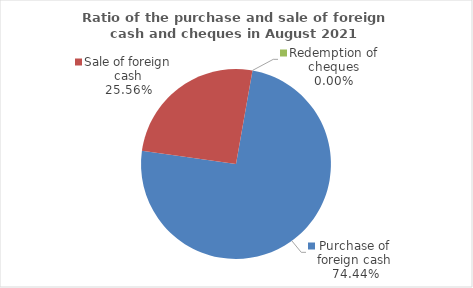
| Category | Series 0 |
|---|---|
| Purchase of foreign cash | 74.438 |
| Sale of foreign cash | 25.562 |
| Redemption of cheques | 0 |